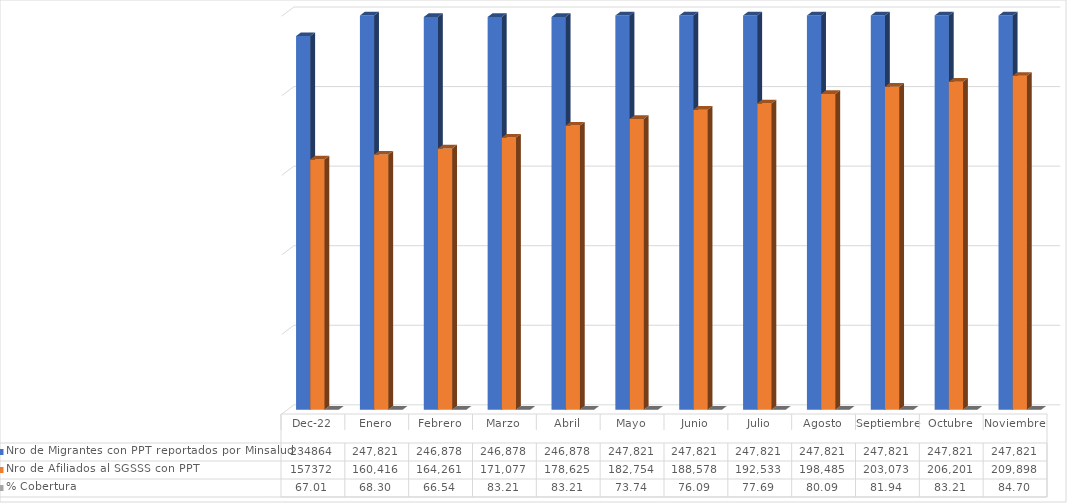
| Category | Nro de Migrantes con PPT reportados por Minsalud  | Nro de Afiliados al SGSSS con PPT | % Cobertura |
|---|---|---|---|
| dic-22 | 234864 | 157372 | 67.006 |
| Enero | 247821 | 160416 | 68.302 |
| Febrero | 246878 | 164261 | 66.535 |
| Marzo | 246878 | 171077 | 83.206 |
| Abril | 246878 | 178625 | 83.206 |
| Mayo | 247821 | 182754 | 73.744 |
| Junio | 247821 | 188578 | 76.094 |
| Julio | 247821 | 192533 | 77.69 |
| Agosto | 247821 | 198485 | 80.092 |
| Septiembre | 247821 | 203073 | 81.943 |
| Octubre | 247821 | 206201 | 83.206 |
| Noviembre | 247821 | 209898 | 84.697 |